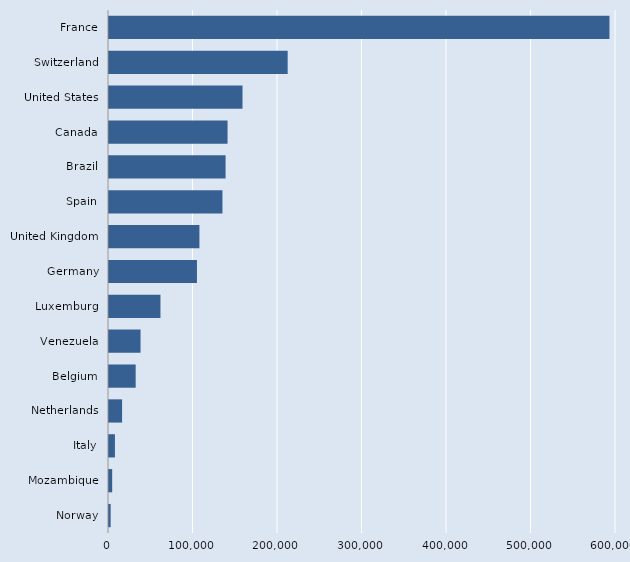
| Category | Series 0 |
|---|---|
| Norway | 1967 |
| Mozambique | 3767 |
| Italy | 7023 |
| Netherlands | 15486 |
| Belgium | 31564 |
| Venezuela | 37326 |
| Luxemburg | 60897 |
| Germany | 104084 |
| United Kingdom | 107000 |
| Spain | 134248 |
| Brazil | 137973 |
| Canada | 140310 |
| United States | 158002 |
| Switzerland | 211451 |
| France | 592281 |